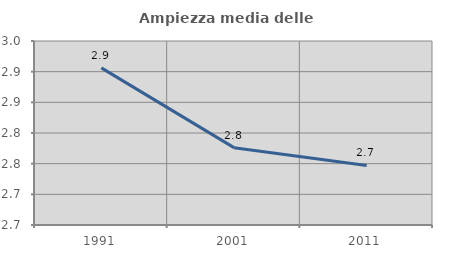
| Category | Ampiezza media delle famiglie |
|---|---|
| 1991.0 | 2.906 |
| 2001.0 | 2.776 |
| 2011.0 | 2.747 |